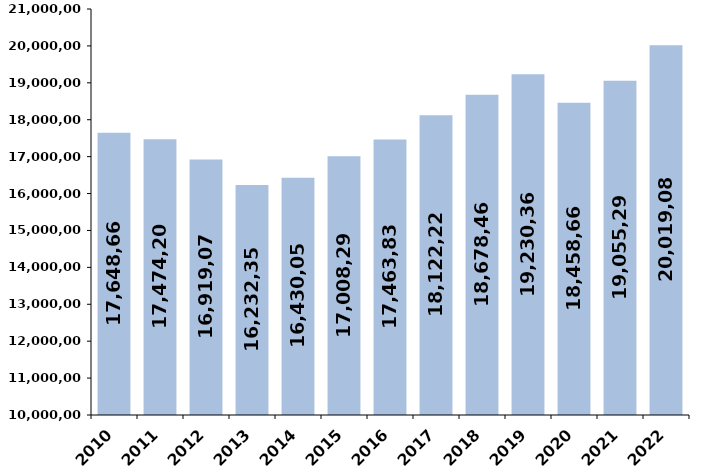
| Category | % de variación
 interanual |
|---|---|
| 2010 | 17648660.1 |
| 2011 | 17474200.78 |
| 2012 | 16919079.21 |
| 2013 | 16232352.31 |
| 2014 | 16430052.95 |
| 2015 | 17008295.9 |
| 2016 | 17463835.63 |
| 2017 | 18122222.3 |
| 2018 | 18678460.85 |
| 2019 | 19230361.75 |
| 2020 | 18458667 |
| 2021 | 19055298 |
| 2022 | 20019080.316 |